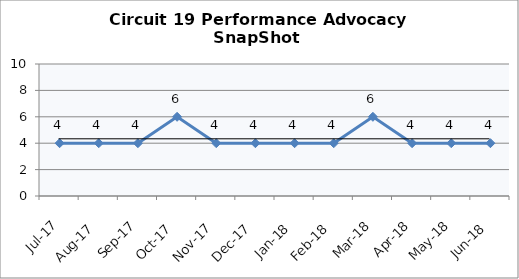
| Category | Circuit 19 |
|---|---|
| Jul-17 | 4 |
| Aug-17 | 4 |
| Sep-17 | 4 |
| Oct-17 | 6 |
| Nov-17 | 4 |
| Dec-17 | 4 |
| Jan-18 | 4 |
| Feb-18 | 4 |
| Mar-18 | 6 |
| Apr-18 | 4 |
| May-18 | 4 |
| Jun-18 | 4 |